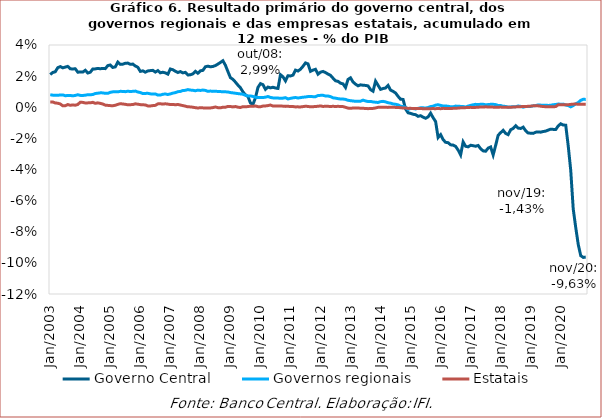
| Category | Governo Central | Governos regionais | Estatais |
|---|---|---|---|
| 2003-01-01 | 0.021 | 0.008 | 0.003 |
| 2003-02-01 | 0.022 | 0.008 | 0.003 |
| 2003-03-01 | 0.023 | 0.008 | 0.003 |
| 2003-04-01 | 0.025 | 0.008 | 0.003 |
| 2003-05-01 | 0.026 | 0.008 | 0.002 |
| 2003-06-01 | 0.025 | 0.008 | 0.001 |
| 2003-07-01 | 0.026 | 0.007 | 0.001 |
| 2003-08-01 | 0.026 | 0.008 | 0.002 |
| 2003-09-01 | 0.025 | 0.008 | 0.001 |
| 2003-10-01 | 0.025 | 0.007 | 0.001 |
| 2003-11-01 | 0.025 | 0.008 | 0.001 |
| 2003-12-01 | 0.023 | 0.008 | 0.002 |
| 2004-01-01 | 0.023 | 0.008 | 0.003 |
| 2004-02-01 | 0.023 | 0.008 | 0.003 |
| 2004-03-01 | 0.024 | 0.008 | 0.003 |
| 2004-04-01 | 0.022 | 0.008 | 0.003 |
| 2004-05-01 | 0.023 | 0.008 | 0.003 |
| 2004-06-01 | 0.025 | 0.008 | 0.003 |
| 2004-07-01 | 0.025 | 0.009 | 0.003 |
| 2004-08-01 | 0.025 | 0.009 | 0.003 |
| 2004-09-01 | 0.025 | 0.009 | 0.002 |
| 2004-10-01 | 0.025 | 0.009 | 0.002 |
| 2004-11-01 | 0.025 | 0.009 | 0.001 |
| 2004-12-01 | 0.027 | 0.009 | 0.001 |
| 2005-01-01 | 0.027 | 0.01 | 0.001 |
| 2005-02-01 | 0.026 | 0.01 | 0.001 |
| 2005-03-01 | 0.026 | 0.01 | 0.001 |
| 2005-04-01 | 0.029 | 0.01 | 0.002 |
| 2005-05-01 | 0.028 | 0.01 | 0.002 |
| 2005-06-01 | 0.028 | 0.01 | 0.002 |
| 2005-07-01 | 0.028 | 0.01 | 0.002 |
| 2005-08-01 | 0.028 | 0.01 | 0.002 |
| 2005-09-01 | 0.028 | 0.01 | 0.002 |
| 2005-10-01 | 0.028 | 0.01 | 0.002 |
| 2005-11-01 | 0.027 | 0.01 | 0.002 |
| 2005-12-01 | 0.026 | 0.01 | 0.002 |
| 2006-01-01 | 0.023 | 0.009 | 0.002 |
| 2006-02-01 | 0.023 | 0.009 | 0.002 |
| 2006-03-01 | 0.023 | 0.009 | 0.002 |
| 2006-04-01 | 0.023 | 0.009 | 0.001 |
| 2006-05-01 | 0.024 | 0.009 | 0.001 |
| 2006-06-01 | 0.024 | 0.008 | 0.001 |
| 2006-07-01 | 0.023 | 0.009 | 0.001 |
| 2006-08-01 | 0.024 | 0.008 | 0.002 |
| 2006-09-01 | 0.022 | 0.008 | 0.002 |
| 2006-10-01 | 0.023 | 0.008 | 0.002 |
| 2006-11-01 | 0.022 | 0.009 | 0.002 |
| 2006-12-01 | 0.021 | 0.008 | 0.002 |
| 2007-01-01 | 0.025 | 0.009 | 0.002 |
| 2007-02-01 | 0.024 | 0.009 | 0.002 |
| 2007-03-01 | 0.023 | 0.009 | 0.002 |
| 2007-04-01 | 0.022 | 0.01 | 0.002 |
| 2007-05-01 | 0.023 | 0.01 | 0.001 |
| 2007-06-01 | 0.022 | 0.011 | 0.001 |
| 2007-07-01 | 0.022 | 0.011 | 0.001 |
| 2007-08-01 | 0.021 | 0.011 | 0 |
| 2007-09-01 | 0.021 | 0.011 | 0 |
| 2007-10-01 | 0.021 | 0.011 | 0 |
| 2007-11-01 | 0.023 | 0.011 | 0 |
| 2007-12-01 | 0.022 | 0.011 | 0 |
| 2008-01-01 | 0.023 | 0.011 | 0 |
| 2008-02-01 | 0.024 | 0.011 | 0 |
| 2008-03-01 | 0.026 | 0.011 | -0.001 |
| 2008-04-01 | 0.026 | 0.01 | -0.001 |
| 2008-05-01 | 0.026 | 0.01 | 0 |
| 2008-06-01 | 0.026 | 0.01 | 0 |
| 2008-07-01 | 0.027 | 0.01 | 0 |
| 2008-08-01 | 0.028 | 0.01 | 0 |
| 2008-09-01 | 0.029 | 0.01 | 0 |
| 2008-10-01 | 0.03 | 0.01 | 0 |
| 2008-11-01 | 0.027 | 0.01 | 0 |
| 2008-12-01 | 0.023 | 0.01 | 0.001 |
| 2009-01-01 | 0.019 | 0.009 | 0 |
| 2009-02-01 | 0.018 | 0.009 | 0 |
| 2009-03-01 | 0.016 | 0.009 | 0 |
| 2009-04-01 | 0.014 | 0.009 | 0 |
| 2009-05-01 | 0.013 | 0.009 | 0 |
| 2009-06-01 | 0.01 | 0.008 | 0 |
| 2009-07-01 | 0.008 | 0.008 | 0 |
| 2009-08-01 | 0.007 | 0.007 | 0 |
| 2009-09-01 | 0.003 | 0.007 | 0.001 |
| 2009-10-01 | 0.002 | 0.007 | 0.001 |
| 2009-11-01 | 0.006 | 0.006 | 0.001 |
| 2009-12-01 | 0.013 | 0.006 | 0 |
| 2010-01-01 | 0.015 | 0.006 | 0 |
| 2010-02-01 | 0.015 | 0.006 | 0.001 |
| 2010-03-01 | 0.012 | 0.006 | 0.001 |
| 2010-04-01 | 0.013 | 0.007 | 0.001 |
| 2010-05-01 | 0.012 | 0.006 | 0.001 |
| 2010-06-01 | 0.013 | 0.006 | 0.001 |
| 2010-07-01 | 0.012 | 0.006 | 0.001 |
| 2010-08-01 | 0.012 | 0.006 | 0.001 |
| 2010-09-01 | 0.021 | 0.006 | 0.001 |
| 2010-10-01 | 0.02 | 0.006 | 0.001 |
| 2010-11-01 | 0.017 | 0.006 | 0.001 |
| 2010-12-01 | 0.02 | 0.005 | 0.001 |
| 2011-01-01 | 0.02 | 0.006 | 0 |
| 2011-02-01 | 0.021 | 0.006 | 0 |
| 2011-03-01 | 0.024 | 0.006 | 0 |
| 2011-04-01 | 0.023 | 0.006 | 0 |
| 2011-05-01 | 0.024 | 0.006 | 0 |
| 2011-06-01 | 0.026 | 0.006 | 0 |
| 2011-07-01 | 0.028 | 0.007 | 0.001 |
| 2011-08-01 | 0.028 | 0.007 | 0.001 |
| 2011-09-01 | 0.023 | 0.007 | 0 |
| 2011-10-01 | 0.024 | 0.007 | 0 |
| 2011-11-01 | 0.024 | 0.007 | 0 |
| 2011-12-01 | 0.021 | 0.008 | 0.001 |
| 2012-01-01 | 0.023 | 0.008 | 0.001 |
| 2012-02-01 | 0.023 | 0.008 | 0.001 |
| 2012-03-01 | 0.022 | 0.007 | 0.001 |
| 2012-04-01 | 0.021 | 0.007 | 0.001 |
| 2012-05-01 | 0.02 | 0.007 | 0 |
| 2012-06-01 | 0.019 | 0.006 | 0.001 |
| 2012-07-01 | 0.017 | 0.006 | 0 |
| 2012-08-01 | 0.017 | 0.006 | 0.001 |
| 2012-09-01 | 0.015 | 0.005 | 0 |
| 2012-10-01 | 0.015 | 0.005 | 0 |
| 2012-11-01 | 0.013 | 0.005 | 0 |
| 2012-12-01 | 0.018 | 0.004 | -0.001 |
| 2013-01-01 | 0.019 | 0.004 | -0.001 |
| 2013-02-01 | 0.016 | 0.004 | -0.001 |
| 2013-03-01 | 0.015 | 0.004 | 0 |
| 2013-04-01 | 0.014 | 0.004 | 0 |
| 2013-05-01 | 0.014 | 0.004 | -0.001 |
| 2013-06-01 | 0.014 | 0.005 | -0.001 |
| 2013-07-01 | 0.014 | 0.004 | -0.001 |
| 2013-08-01 | 0.014 | 0.004 | -0.001 |
| 2013-09-01 | 0.011 | 0.004 | -0.001 |
| 2013-10-01 | 0.01 | 0.003 | -0.001 |
| 2013-11-01 | 0.017 | 0.003 | 0 |
| 2013-12-01 | 0.014 | 0.003 | 0 |
| 2014-01-01 | 0.011 | 0.004 | 0 |
| 2014-02-01 | 0.012 | 0.004 | 0 |
| 2014-03-01 | 0.012 | 0.003 | 0 |
| 2014-04-01 | 0.014 | 0.003 | 0 |
| 2014-05-01 | 0.011 | 0.003 | 0 |
| 2014-06-01 | 0.01 | 0.002 | 0 |
| 2014-07-01 | 0.009 | 0.002 | 0 |
| 2014-08-01 | 0.007 | 0.002 | 0 |
| 2014-09-01 | 0.005 | 0.001 | 0 |
| 2014-10-01 | 0.005 | 0 | 0 |
| 2014-11-01 | -0.001 | 0 | 0 |
| 2014-12-01 | -0.004 | -0.001 | -0.001 |
| 2015-01-01 | -0.004 | -0.001 | -0.001 |
| 2015-02-01 | -0.005 | -0.001 | -0.001 |
| 2015-03-01 | -0.005 | -0.001 | -0.001 |
| 2015-04-01 | -0.006 | -0.001 | -0.001 |
| 2015-05-01 | -0.005 | 0 | -0.001 |
| 2015-06-01 | -0.006 | 0 | -0.001 |
| 2015-07-01 | -0.007 | -0.001 | -0.001 |
| 2015-08-01 | -0.006 | 0 | -0.001 |
| 2015-09-01 | -0.004 | 0 | -0.001 |
| 2015-10-01 | -0.007 | 0.001 | -0.001 |
| 2015-11-01 | -0.009 | 0.001 | -0.001 |
| 2015-12-01 | -0.019 | 0.002 | -0.001 |
| 2016-01-01 | -0.018 | 0.001 | -0.001 |
| 2016-02-01 | -0.021 | 0.001 | -0.001 |
| 2016-03-01 | -0.023 | 0.001 | -0.001 |
| 2016-04-01 | -0.023 | 0.001 | -0.001 |
| 2016-05-01 | -0.024 | 0 | -0.001 |
| 2016-06-01 | -0.024 | 0 | -0.001 |
| 2016-07-01 | -0.025 | 0.001 | -0.001 |
| 2016-08-01 | -0.028 | 0.001 | -0.001 |
| 2016-09-01 | -0.031 | 0.001 | 0 |
| 2016-10-01 | -0.022 | 0 | 0 |
| 2016-11-01 | -0.025 | 0 | 0 |
| 2016-12-01 | -0.025 | 0.001 | 0 |
| 2017-01-01 | -0.024 | 0.001 | 0 |
| 2017-02-01 | -0.025 | 0.002 | 0 |
| 2017-03-01 | -0.025 | 0.002 | 0 |
| 2017-04-01 | -0.025 | 0.002 | 0 |
| 2017-05-01 | -0.027 | 0.002 | 0 |
| 2017-06-01 | -0.028 | 0.002 | 0 |
| 2017-07-01 | -0.028 | 0.002 | 0 |
| 2017-08-01 | -0.026 | 0.002 | 0 |
| 2017-09-01 | -0.026 | 0.002 | 0 |
| 2017-10-01 | -0.031 | 0.002 | 0 |
| 2017-11-01 | -0.024 | 0.002 | 0 |
| 2017-12-01 | -0.018 | 0.001 | 0 |
| 2018-01-01 | -0.016 | 0.001 | 0 |
| 2018-02-01 | -0.015 | 0.001 | 0 |
| 2018-03-01 | -0.017 | 0.001 | 0 |
| 2018-04-01 | -0.018 | 0 | 0 |
| 2018-05-01 | -0.014 | 0 | 0 |
| 2018-06-01 | -0.014 | 0 | 0 |
| 2018-07-01 | -0.012 | 0 | 0 |
| 2018-08-01 | -0.013 | 0.001 | 0 |
| 2018-09-01 | -0.014 | 0.001 | 0 |
| 2018-10-01 | -0.013 | 0 | 0.001 |
| 2018-11-01 | -0.015 | 0 | 0 |
| 2018-12-01 | -0.017 | 0 | 0.001 |
| 2019-01-01 | -0.017 | 0.001 | 0.001 |
| 2019-02-01 | -0.017 | 0.001 | 0.001 |
| 2019-03-01 | -0.016 | 0.001 | 0.001 |
| 2019-04-01 | -0.016 | 0.002 | 0.001 |
| 2019-05-01 | -0.016 | 0.001 | 0.001 |
| 2019-06-01 | -0.016 | 0.001 | 0 |
| 2019-07-01 | -0.015 | 0.001 | 0 |
| 2019-08-01 | -0.015 | 0.001 | 0 |
| 2019-09-01 | -0.014 | 0.001 | 0 |
| 2019-10-01 | -0.014 | 0.002 | 0 |
| 2019-11-01 | -0.014 | 0.002 | 0 |
| 2019-12-01 | -0.012 | 0.002 | 0.002 |
| 2020-01-01 | -0.011 | 0.002 | 0.002 |
| 2020-02-01 | -0.011 | 0.002 | 0.002 |
| 2020-03-01 | -0.012 | 0.001 | 0.002 |
| 2020-04-01 | -0.025 | 0.001 | 0.002 |
| 2020-05-01 | -0.041 | 0 | 0.002 |
| 2020-06-01 | -0.065 | 0.001 | 0.002 |
| 2020-07-01 | -0.077 | 0.002 | 0.002 |
| 2020-08-01 | -0.088 | 0.003 | 0.002 |
| 2020-09-01 | -0.095 | 0.004 | 0.002 |
| 2020-10-01 | -0.096 | 0.005 | 0.002 |
| 2020-11-01 | -0.096 | 0.005 | 0.002 |